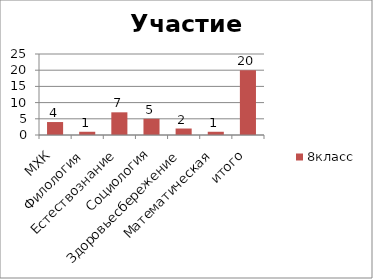
| Category | 8класс | Series 0 |
|---|---|---|
| МХК | 4 |  |
| Филология | 1 |  |
| Естествознание | 7 |  |
| Социология | 5 |  |
| Здоровьесбережение | 2 |  |
| Математическая | 1 |  |
| итого | 20 |  |